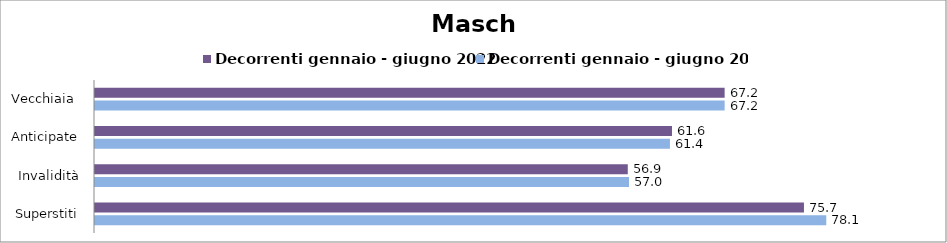
| Category | Decorrenti gennaio - giugno 2022 | Decorrenti gennaio - giugno 2023 |
|---|---|---|
| Vecchiaia  | 67.22 | 67.22 |
| Anticipate | 61.6 | 61.38 |
| Invalidità | 56.88 | 57.01 |
| Superstiti | 75.69 | 78.07 |